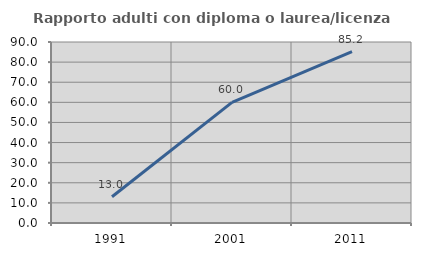
| Category | Rapporto adulti con diploma o laurea/licenza media  |
|---|---|
| 1991.0 | 13.043 |
| 2001.0 | 60 |
| 2011.0 | 85.185 |